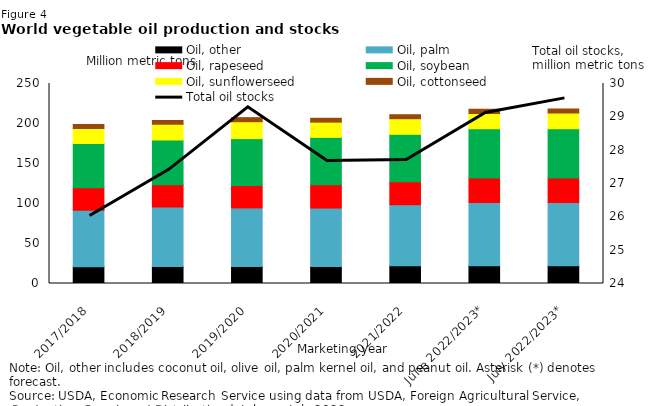
| Category | Oil, other | Oil, palm | Oil, rapeseed | Oil, soybean | Oil, sunflowerseed | Oil, cottonseed |
|---|---|---|---|---|---|---|
| 2017/2018 | 20.963 | 70.646 | 28.132 | 55.279 | 18.578 | 5.118 |
| 2018/2019 | 21.213 | 74.286 | 27.794 | 56.062 | 19.603 | 4.932 |
| 2019/2020 | 21.362 | 73.115 | 28.101 | 58.521 | 21.118 | 5.077 |
| 2020/2021 | 21.178 | 73.138 | 29.177 | 59.182 | 19.043 | 4.786 |
| 2021/2022 | 22.223 | 76.26 | 28.845 | 59.134 | 19.545 | 4.974 |
| June 2022/2023* | 22.106 | 79.141 | 30.741 | 61.509 | 19.049 | 5.173 |
| July 2022/2023* | 22.095 | 79.141 | 30.721 | 61.479 | 19.61 | 5.16 |